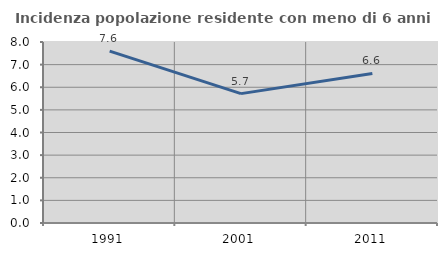
| Category | Incidenza popolazione residente con meno di 6 anni |
|---|---|
| 1991.0 | 7.594 |
| 2001.0 | 5.719 |
| 2011.0 | 6.608 |